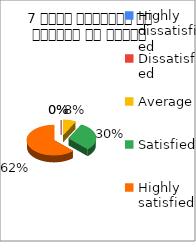
| Category | 7 विषय अवधारणा पर शिक्षक का ज्ञान  |
|---|---|
| Highly dissatisfied | 0 |
| Dissatisfied | 0 |
| Average | 4 |
| Satisfied | 16 |
| Highly satisfied | 33 |